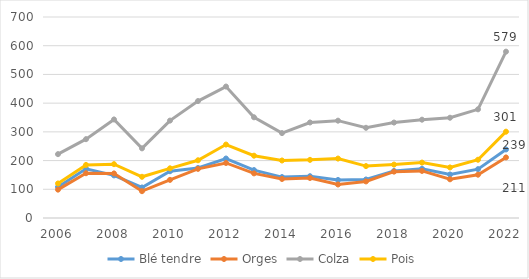
| Category | Blé tendre | Orges | Colza | Pois |
|---|---|---|---|---|
| 2006.0 | 108.11 | 98.739 | 222.374 | 120.25 |
| 2007.0 | 171.397 | 155.925 | 274.505 | 184.75 |
| 2008.0 | 148.396 | 155.196 | 343.233 | 187.5 |
| 2009.0 | 106.288 | 93.403 | 242.571 | 143.5 |
| 2010.0 | 162.887 | 132.797 | 339.223 | 173 |
| 2011.0 | 174.042 | 171.146 | 407.232 | 201 |
| 2012.0 | 207.142 | 191.657 | 457.801 | 255.75 |
| 2013.0 | 166.84 | 155.4 | 350.759 | 217 |
| 2014.0 | 142.476 | 135.962 | 295.657 | 200.25 |
| 2015.0 | 145.491 | 139.386 | 332.656 | 202.5 |
| 2016.0 | 132.42 | 116.723 | 338.973 | 207 |
| 2017.0 | 134.11 | 127.39 | 314.132 | 180.75 |
| 2018.0 | 163.779 | 161.478 | 332.399 | 185.981 |
| 2019.0 | 171.4 | 164 | 342.4 | 193 |
| 2020.0 | 151.5 | 134.8 | 349.2 | 176.1 |
| 2021.0 | 170 | 150.8 | 378.5 | 202.9 |
| 2022.0 | 238.77 | 210.95 | 579.34 | 300.64 |